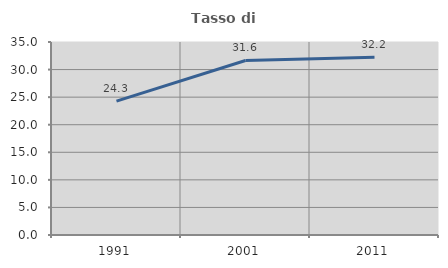
| Category | Tasso di occupazione   |
|---|---|
| 1991.0 | 24.282 |
| 2001.0 | 31.647 |
| 2011.0 | 32.234 |